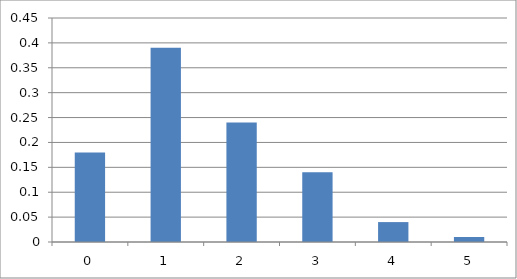
| Category | Series 0 |
|---|---|
| 0.0 | 0.18 |
| 1.0 | 0.39 |
| 2.0 | 0.24 |
| 3.0 | 0.14 |
| 4.0 | 0.04 |
| 5.0 | 0.01 |